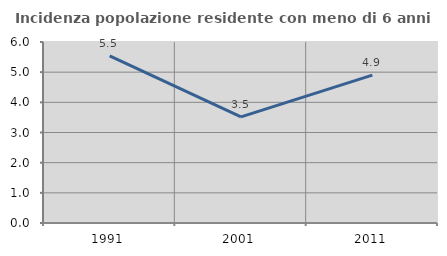
| Category | Incidenza popolazione residente con meno di 6 anni |
|---|---|
| 1991.0 | 5.544 |
| 2001.0 | 3.52 |
| 2011.0 | 4.903 |